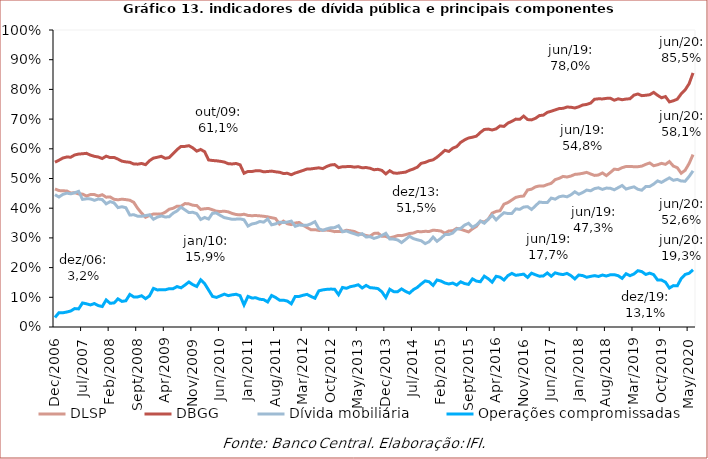
| Category | DLSP | DBGG | Dívida mobiliária | Operações compromissadas |
|---|---|---|---|---|
| 2006-12-01 | 0.465 | 0.555 | 0.446 | 0.032 |
| 2007-01-01 | 0.459 | 0.562 | 0.438 | 0.048 |
| 2007-02-01 | 0.459 | 0.569 | 0.446 | 0.048 |
| 2007-03-01 | 0.458 | 0.572 | 0.451 | 0.05 |
| 2007-04-01 | 0.451 | 0.572 | 0.448 | 0.054 |
| 2007-05-01 | 0.452 | 0.579 | 0.452 | 0.062 |
| 2007-06-01 | 0.448 | 0.582 | 0.457 | 0.061 |
| 2007-07-01 | 0.447 | 0.583 | 0.43 | 0.081 |
| 2007-08-01 | 0.441 | 0.585 | 0.432 | 0.078 |
| 2007-09-01 | 0.446 | 0.579 | 0.431 | 0.074 |
| 2007-10-01 | 0.446 | 0.575 | 0.427 | 0.079 |
| 2007-11-01 | 0.441 | 0.572 | 0.431 | 0.072 |
| 2007-12-01 | 0.445 | 0.567 | 0.429 | 0.069 |
| 2008-01-01 | 0.437 | 0.575 | 0.415 | 0.091 |
| 2008-02-01 | 0.438 | 0.57 | 0.422 | 0.08 |
| 2008-03-01 | 0.43 | 0.571 | 0.418 | 0.081 |
| 2008-04-01 | 0.428 | 0.565 | 0.402 | 0.095 |
| 2008-05-01 | 0.43 | 0.558 | 0.405 | 0.086 |
| 2008-06-01 | 0.429 | 0.556 | 0.402 | 0.088 |
| 2008-07-01 | 0.427 | 0.555 | 0.377 | 0.11 |
| 2008-08-01 | 0.42 | 0.549 | 0.378 | 0.101 |
| 2008-09-01 | 0.4 | 0.548 | 0.373 | 0.101 |
| 2008-10-01 | 0.383 | 0.551 | 0.373 | 0.105 |
| 2008-11-01 | 0.37 | 0.547 | 0.375 | 0.095 |
| 2008-12-01 | 0.376 | 0.56 | 0.378 | 0.105 |
| 2009-01-01 | 0.38 | 0.569 | 0.363 | 0.13 |
| 2009-02-01 | 0.38 | 0.572 | 0.37 | 0.125 |
| 2009-03-01 | 0.38 | 0.575 | 0.374 | 0.126 |
| 2009-04-01 | 0.386 | 0.568 | 0.37 | 0.125 |
| 2009-05-01 | 0.397 | 0.571 | 0.371 | 0.129 |
| 2009-06-01 | 0.4 | 0.583 | 0.383 | 0.129 |
| 2009-07-01 | 0.407 | 0.597 | 0.391 | 0.136 |
| 2009-08-01 | 0.407 | 0.608 | 0.403 | 0.132 |
| 2009-09-01 | 0.416 | 0.608 | 0.394 | 0.141 |
| 2009-10-01 | 0.415 | 0.611 | 0.385 | 0.152 |
| 2009-11-01 | 0.41 | 0.603 | 0.386 | 0.143 |
| 2009-12-01 | 0.409 | 0.592 | 0.382 | 0.136 |
| 2010-01-01 | 0.396 | 0.598 | 0.362 | 0.159 |
| 2010-02-01 | 0.398 | 0.59 | 0.369 | 0.146 |
| 2010-03-01 | 0.399 | 0.562 | 0.364 | 0.125 |
| 2010-04-01 | 0.395 | 0.561 | 0.383 | 0.103 |
| 2010-05-01 | 0.39 | 0.56 | 0.384 | 0.1 |
| 2010-06-01 | 0.389 | 0.558 | 0.376 | 0.105 |
| 2010-07-01 | 0.39 | 0.555 | 0.368 | 0.111 |
| 2010-08-01 | 0.388 | 0.55 | 0.366 | 0.106 |
| 2010-09-01 | 0.382 | 0.549 | 0.363 | 0.108 |
| 2010-10-01 | 0.379 | 0.551 | 0.363 | 0.11 |
| 2010-11-01 | 0.377 | 0.546 | 0.364 | 0.106 |
| 2010-12-01 | 0.38 | 0.518 | 0.361 | 0.074 |
| 2011-01-01 | 0.376 | 0.524 | 0.34 | 0.103 |
| 2011-02-01 | 0.375 | 0.524 | 0.347 | 0.098 |
| 2011-03-01 | 0.375 | 0.526 | 0.35 | 0.098 |
| 2011-04-01 | 0.374 | 0.526 | 0.355 | 0.093 |
| 2011-05-01 | 0.373 | 0.523 | 0.353 | 0.092 |
| 2011-06-01 | 0.371 | 0.524 | 0.364 | 0.084 |
| 2011-07-01 | 0.368 | 0.525 | 0.344 | 0.106 |
| 2011-08-01 | 0.365 | 0.523 | 0.347 | 0.1 |
| 2011-09-01 | 0.347 | 0.521 | 0.353 | 0.09 |
| 2011-10-01 | 0.356 | 0.517 | 0.352 | 0.09 |
| 2011-11-01 | 0.348 | 0.517 | 0.353 | 0.087 |
| 2011-12-01 | 0.345 | 0.513 | 0.357 | 0.078 |
| 2012-01-01 | 0.35 | 0.519 | 0.339 | 0.103 |
| 2012-02-01 | 0.352 | 0.523 | 0.343 | 0.103 |
| 2012-03-01 | 0.343 | 0.527 | 0.342 | 0.107 |
| 2012-04-01 | 0.335 | 0.532 | 0.342 | 0.11 |
| 2012-05-01 | 0.327 | 0.532 | 0.347 | 0.103 |
| 2012-06-01 | 0.328 | 0.534 | 0.355 | 0.097 |
| 2012-07-01 | 0.325 | 0.536 | 0.331 | 0.122 |
| 2012-08-01 | 0.326 | 0.533 | 0.325 | 0.125 |
| 2012-09-01 | 0.326 | 0.541 | 0.33 | 0.127 |
| 2012-10-01 | 0.325 | 0.546 | 0.334 | 0.128 |
| 2012-11-01 | 0.321 | 0.547 | 0.335 | 0.127 |
| 2012-12-01 | 0.322 | 0.537 | 0.341 | 0.109 |
| 2013-01-01 | 0.322 | 0.54 | 0.321 | 0.133 |
| 2013-02-01 | 0.326 | 0.54 | 0.323 | 0.13 |
| 2013-03-01 | 0.324 | 0.541 | 0.318 | 0.136 |
| 2013-04-01 | 0.322 | 0.538 | 0.314 | 0.138 |
| 2013-05-01 | 0.315 | 0.54 | 0.309 | 0.142 |
| 2013-06-01 | 0.312 | 0.536 | 0.314 | 0.131 |
| 2013-07-01 | 0.308 | 0.537 | 0.303 | 0.14 |
| 2013-08-01 | 0.306 | 0.534 | 0.304 | 0.133 |
| 2013-09-01 | 0.315 | 0.529 | 0.298 | 0.131 |
| 2013-10-01 | 0.316 | 0.531 | 0.303 | 0.129 |
| 2013-11-01 | 0.306 | 0.527 | 0.308 | 0.118 |
| 2013-12-01 | 0.305 | 0.515 | 0.315 | 0.099 |
| 2014-01-01 | 0.3 | 0.526 | 0.296 | 0.127 |
| 2014-02-01 | 0.304 | 0.518 | 0.296 | 0.119 |
| 2014-03-01 | 0.308 | 0.518 | 0.293 | 0.119 |
| 2014-04-01 | 0.308 | 0.52 | 0.284 | 0.128 |
| 2014-05-01 | 0.311 | 0.521 | 0.294 | 0.12 |
| 2014-06-01 | 0.315 | 0.527 | 0.305 | 0.114 |
| 2014-07-01 | 0.316 | 0.532 | 0.298 | 0.126 |
| 2014-08-01 | 0.321 | 0.538 | 0.294 | 0.133 |
| 2014-09-01 | 0.321 | 0.551 | 0.29 | 0.145 |
| 2014-10-01 | 0.322 | 0.554 | 0.281 | 0.155 |
| 2014-11-01 | 0.322 | 0.56 | 0.287 | 0.152 |
| 2014-12-01 | 0.326 | 0.563 | 0.303 | 0.14 |
| 2015-01-01 | 0.325 | 0.572 | 0.289 | 0.158 |
| 2015-02-01 | 0.323 | 0.583 | 0.299 | 0.155 |
| 2015-03-01 | 0.316 | 0.595 | 0.311 | 0.148 |
| 2015-04-01 | 0.323 | 0.591 | 0.311 | 0.145 |
| 2015-05-01 | 0.324 | 0.602 | 0.316 | 0.148 |
| 2015-06-01 | 0.332 | 0.607 | 0.33 | 0.141 |
| 2015-07-01 | 0.329 | 0.622 | 0.332 | 0.152 |
| 2015-08-01 | 0.325 | 0.63 | 0.343 | 0.146 |
| 2015-09-01 | 0.32 | 0.636 | 0.349 | 0.143 |
| 2015-10-01 | 0.33 | 0.639 | 0.336 | 0.162 |
| 2015-11-01 | 0.339 | 0.643 | 0.343 | 0.155 |
| 2015-12-01 | 0.356 | 0.655 | 0.357 | 0.152 |
| 2016-01-01 | 0.353 | 0.665 | 0.349 | 0.171 |
| 2016-02-01 | 0.363 | 0.666 | 0.362 | 0.163 |
| 2016-03-01 | 0.383 | 0.663 | 0.376 | 0.151 |
| 2016-04-01 | 0.389 | 0.667 | 0.361 | 0.171 |
| 2016-05-01 | 0.392 | 0.677 | 0.374 | 0.168 |
| 2016-06-01 | 0.414 | 0.675 | 0.385 | 0.158 |
| 2016-07-01 | 0.419 | 0.687 | 0.382 | 0.173 |
| 2016-08-01 | 0.428 | 0.692 | 0.382 | 0.181 |
| 2016-09-01 | 0.436 | 0.7 | 0.398 | 0.174 |
| 2016-10-01 | 0.44 | 0.699 | 0.396 | 0.176 |
| 2016-11-01 | 0.441 | 0.71 | 0.404 | 0.178 |
| 2016-12-01 | 0.461 | 0.698 | 0.405 | 0.167 |
| 2017-01-01 | 0.464 | 0.697 | 0.396 | 0.181 |
| 2017-02-01 | 0.472 | 0.703 | 0.408 | 0.176 |
| 2017-03-01 | 0.475 | 0.712 | 0.421 | 0.171 |
| 2017-04-01 | 0.475 | 0.713 | 0.419 | 0.172 |
| 2017-05-01 | 0.48 | 0.723 | 0.419 | 0.182 |
| 2017-06-01 | 0.484 | 0.726 | 0.434 | 0.171 |
| 2017-07-01 | 0.496 | 0.731 | 0.43 | 0.182 |
| 2017-08-01 | 0.5 | 0.735 | 0.438 | 0.178 |
| 2017-09-01 | 0.507 | 0.736 | 0.441 | 0.177 |
| 2017-10-01 | 0.505 | 0.741 | 0.438 | 0.18 |
| 2017-11-01 | 0.508 | 0.74 | 0.445 | 0.173 |
| 2017-12-01 | 0.514 | 0.737 | 0.455 | 0.162 |
| 2018-01-01 | 0.515 | 0.741 | 0.447 | 0.175 |
| 2018-02-01 | 0.518 | 0.748 | 0.453 | 0.173 |
| 2018-03-01 | 0.521 | 0.749 | 0.461 | 0.168 |
| 2018-04-01 | 0.515 | 0.754 | 0.459 | 0.17 |
| 2018-05-01 | 0.51 | 0.767 | 0.466 | 0.173 |
| 2018-06-01 | 0.512 | 0.768 | 0.469 | 0.17 |
| 2018-07-01 | 0.519 | 0.768 | 0.463 | 0.175 |
| 2018-08-01 | 0.51 | 0.77 | 0.468 | 0.172 |
| 2018-09-01 | 0.52 | 0.77 | 0.467 | 0.176 |
| 2018-10-01 | 0.532 | 0.763 | 0.462 | 0.176 |
| 2018-11-01 | 0.53 | 0.768 | 0.469 | 0.173 |
| 2018-12-01 | 0.536 | 0.765 | 0.476 | 0.164 |
| 2019-01-01 | 0.54 | 0.768 | 0.464 | 0.179 |
| 2019-02-01 | 0.54 | 0.769 | 0.469 | 0.173 |
| 2019-03-01 | 0.54 | 0.781 | 0.472 | 0.179 |
| 2019-04-01 | 0.54 | 0.785 | 0.464 | 0.19 |
| 2019-05-01 | 0.542 | 0.779 | 0.461 | 0.186 |
| 2019-06-01 | 0.548 | 0.78 | 0.473 | 0.177 |
| 2019-07-01 | 0.552 | 0.782 | 0.473 | 0.181 |
| 2019-08-01 | 0.543 | 0.79 | 0.481 | 0.176 |
| 2019-09-01 | 0.546 | 0.78 | 0.492 | 0.158 |
| 2019-10-01 | 0.551 | 0.772 | 0.487 | 0.158 |
| 2019-11-01 | 0.548 | 0.776 | 0.495 | 0.151 |
| 2019-12-01 | 0.557 | 0.758 | 0.502 | 0.131 |
| 2020-01-01 | 0.542 | 0.762 | 0.494 | 0.139 |
| 2020-02-01 | 0.536 | 0.767 | 0.497 | 0.139 |
| 2020-03-01 | 0.518 | 0.785 | 0.491 | 0.163 |
| 2020-04-01 | 0.528 | 0.798 | 0.491 | 0.177 |
| 2020-05-01 | 0.55 | 0.819 | 0.507 | 0.181 |
| 2020-06-01 | 0.581 | 0.855 | 0.526 | 0.193 |